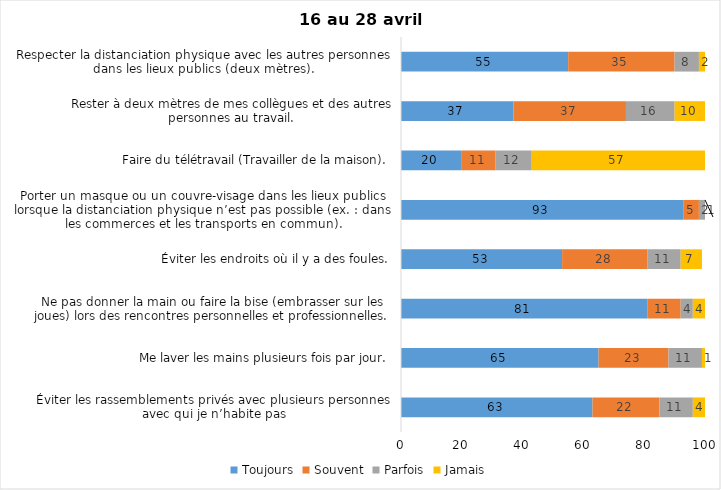
| Category | Toujours | Souvent | Parfois | Jamais |
|---|---|---|---|---|
| Éviter les rassemblements privés avec plusieurs personnes avec qui je n’habite pas | 63 | 22 | 11 | 4 |
| Me laver les mains plusieurs fois par jour. | 65 | 23 | 11 | 1 |
| Ne pas donner la main ou faire la bise (embrasser sur les joues) lors des rencontres personnelles et professionnelles. | 81 | 11 | 4 | 4 |
| Éviter les endroits où il y a des foules. | 53 | 28 | 11 | 7 |
| Porter un masque ou un couvre-visage dans les lieux publics lorsque la distanciation physique n’est pas possible (ex. : dans les commerces et les transports en commun). | 93 | 5 | 2 | 1 |
| Faire du télétravail (Travailler de la maison). | 20 | 11 | 12 | 57 |
| Rester à deux mètres de mes collègues et des autres personnes au travail. | 37 | 37 | 16 | 10 |
| Respecter la distanciation physique avec les autres personnes dans les lieux publics (deux mètres). | 55 | 35 | 8 | 2 |